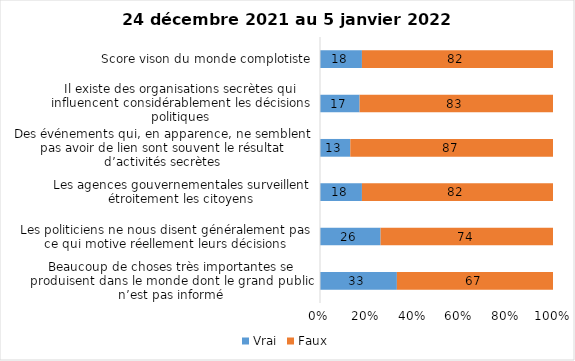
| Category | Vrai | Faux |
|---|---|---|
| Beaucoup de choses très importantes se produisent dans le monde dont le grand public n’est pas informé | 33 | 67 |
| Les politiciens ne nous disent généralement pas ce qui motive réellement leurs décisions | 26 | 74 |
| Les agences gouvernementales surveillent étroitement les citoyens | 18 | 82 |
| Des événements qui, en apparence, ne semblent pas avoir de lien sont souvent le résultat d’activités secrètes | 13 | 87 |
| Il existe des organisations secrètes qui influencent considérablement les décisions politiques | 17 | 83 |
| Score vison du monde complotiste | 18 | 82 |